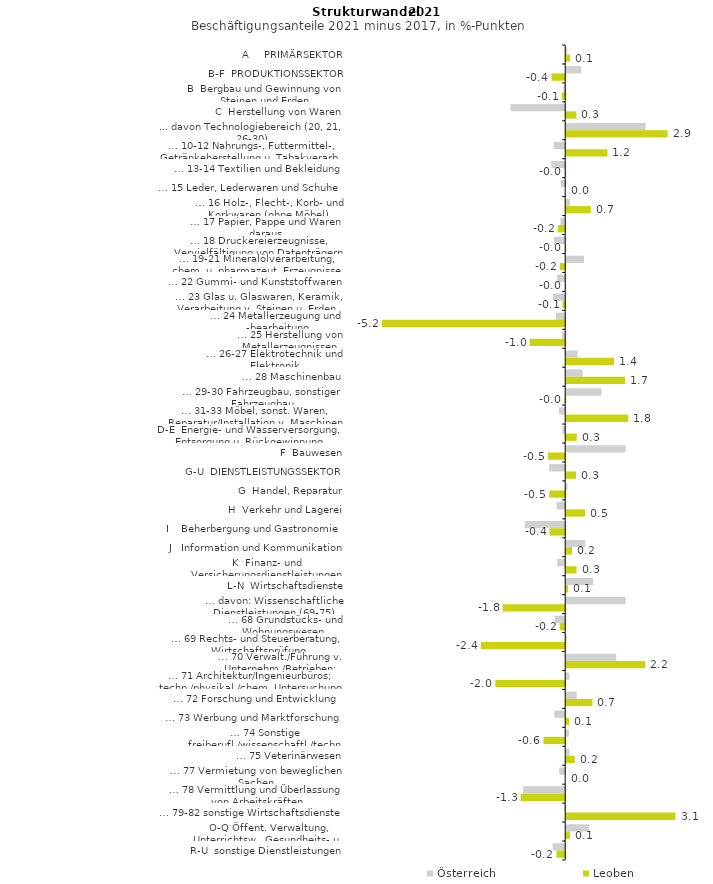
| Category | Österreich | Leoben |
|---|---|---|
| A     PRIMÄRSEKTOR | 0.029 | 0.11 |
| B-F  PRODUKTIONSSEKTOR | 0.429 | -0.389 |
| B  Bergbau und Gewinnung von Steinen und Erden | -0.054 | -0.097 |
| C  Herstellung von Waren | -1.552 | 0.289 |
| ... davon Technologiebereich (20, 21, 26-30) | 2.256 | 2.883 |
| … 10-12 Nahrungs-, Futtermittel-, Getränkeherstellung u. Tabakverarb. | -0.33 | 1.171 |
| … 13-14 Textilien und Bekleidung | -0.397 | -0.003 |
| … 15 Leder, Lederwaren und Schuhe | -0.119 | 0 |
| … 16 Holz-, Flecht-, Korb- und Korkwaren (ohne Möbel)  | 0.11 | 0.7 |
| … 17 Papier, Pappe und Waren daraus  | -0.136 | -0.212 |
| … 18 Druckereierzeugnisse, Vervielfältigung von Datenträgern | -0.317 | -0.009 |
| … 19-21 Mineralölverarbeitung, chem. u. pharmazeut. Erzeugnisse | 0.503 | -0.151 |
| … 22 Gummi- und Kunststoffwaren | -0.229 | -0.004 |
| … 23 Glas u. Glaswaren, Keramik, Verarbeitung v. Steinen u. Erden  | -0.345 | -0.074 |
| … 24 Metallerzeugung und -bearbeitung | -0.269 | -5.206 |
| … 25 Herstellung von Metallerzeugnissen  | -0.086 | -1.01 |
| … 26-27 Elektrotechnik und Elektronik | 0.325 | 1.359 |
| … 28 Maschinenbau | 0.465 | 1.674 |
| … 29-30 Fahrzeugbau, sonstiger Fahrzeugbau | 1.003 | -0.015 |
| … 31-33 Möbel, sonst. Waren, Reparatur/Installation v. Maschinen | -0.178 | 1.764 |
| D-E  Energie- und Wasserversorgung, Entsorgung u. Rückgewinnung | -0.083 | 0.298 |
| F  Bauwesen | 1.689 | -0.49 |
| G-U  DIENSTLEISTUNGSSEKTOR | -0.458 | 0.279 |
| G  Handel, Reparatur | 0.035 | -0.452 |
| H  Verkehr und Lagerei | -0.247 | 0.534 |
| I    Beherbergung und Gastronomie | -1.152 | -0.444 |
| J   Information und Kommunikation | 0.543 | 0.166 |
| K  Finanz- und Versicherungsdienstleistungen | -0.232 | 0.293 |
| L-N  Wirtschaftsdienste | 0.764 | 0.054 |
| … davon: Wissenschaftliche Dienstleistungen (69-75) | 1.689 | -1.779 |
| … 68 Grundstücks- und Wohnungswesen  | -0.302 | -0.155 |
| … 69 Rechts- und Steuerberatung, Wirtschaftsprüfung | 0.021 | -2.396 |
| … 70 Verwalt./Führung v. Unternehm./Betrieben; Unternehmensberat. | 1.422 | 2.243 |
| … 71 Architektur/Ingenieurbüros; techn./physikal./chem. Untersuchung | 0.093 | -1.985 |
| … 72 Forschung und Entwicklung  | 0.296 | 0.746 |
| … 73 Werbung und Marktforschung | -0.315 | 0.078 |
| … 74 Sonstige freiberufl./wissenschaftl./techn. Tätigkeiten | 0.077 | -0.617 |
| … 75 Veterinärwesen | 0.095 | 0.245 |
| … 77 Vermietung von beweglichen Sachen  | -0.17 | 0 |
| … 78 Vermittlung und Überlassung von Arbeitskräften | -1.195 | -1.266 |
| … 79-82 sonstige Wirtschaftsdienste | -0.022 | 3.107 |
| O-Q Öffent. Verwaltung, Unterrichtsw., Gesundheits- u. Sozialwesen | 0.646 | 0.106 |
| R-U  sonstige Dienstleistungen | -0.357 | -0.249 |